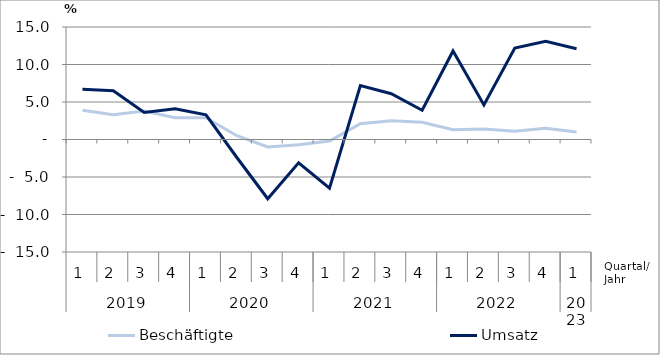
| Category | Beschäftigte | Umsatz |
|---|---|---|
| 0 | 3.9 | 6.7 |
| 1 | 3.3 | 6.5 |
| 2 | 3.8 | 3.6 |
| 3 | 2.9 | 4.1 |
| 4 | 2.9 | 3.3 |
| 5 | 0.5 | -2.4 |
| 6 | -1 | -7.9 |
| 7 | -0.7 | -3.1 |
| 8 | -0.2 | -6.5 |
| 9 | 2.1 | 7.2 |
| 10 | 2.5 | 6.1 |
| 11 | 2.3 | 3.9 |
| 12 | 1.3 | 11.8 |
| 13 | 1.4 | 4.6 |
| 14 | 1.1 | 12.2 |
| 15 | 1.5 | 13.1 |
| 16 | 1 | 12.1 |